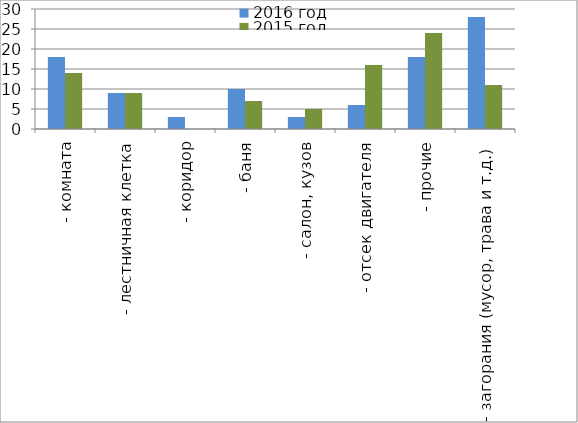
| Category | 2016 год | 2015 год |
|---|---|---|
|  - комната | 18 | 14 |
|  - лестничная клетка | 9 | 9 |
|  - коридор | 3 | 0 |
|  - баня | 10 | 7 |
|  - салон, кузов | 3 | 5 |
|  - отсек двигателя | 6 | 16 |
| - прочие | 18 | 24 |
| - загорания (мусор, трава и т.д.)  | 28 | 11 |